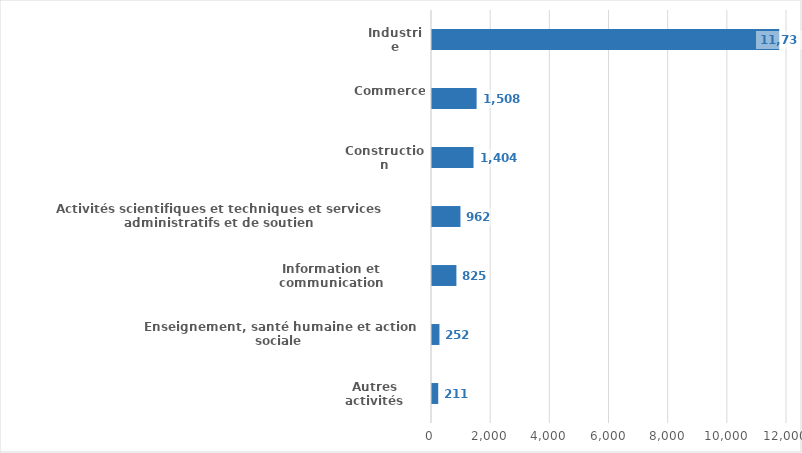
| Category | Paiements en M€ |
|---|---|
| Autres activités | 210.5 |
| Enseignement, santé humaine et action sociale | 251.8 |
| Information et communication | 824.8 |
| Activités scientifiques et techniques et services administratifs et de soutien | 961.6 |
| Construction | 1403.8 |
| Commerce | 1507.7 |
| Industrie | 11738.6 |